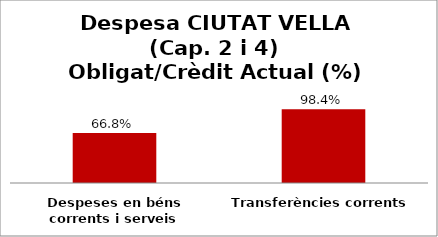
| Category | Series 0 |
|---|---|
| Despeses en béns corrents i serveis | 0.668 |
| Transferències corrents | 0.984 |